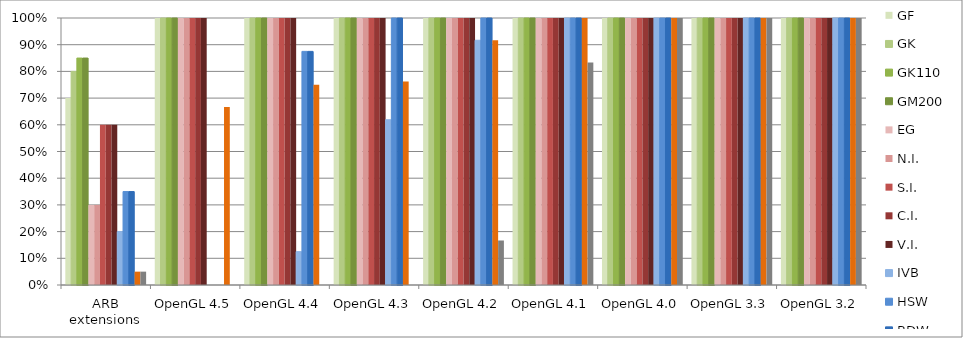
| Category | GF | GK | GK110 | GM200 | EG | N.I. | S.I. | C.I. | V.I. | IVB | HSW | BDW | Mesa | MacOS X |
|---|---|---|---|---|---|---|---|---|---|---|---|---|---|---|
| ARB extensions | 0.7 | 0.8 | 0.85 | 0.85 | 0.3 | 0.3 | 0.6 | 0.6 | 0.6 | 0.2 | 0.35 | 0.35 | 0.05 | 0.05 |
| OpenGL 4.5 | 1 | 1 | 1 | 1 | 1 | 1 | 1 | 1 | 1 | 0 | 0 | 0 | 0.667 | 0 |
| OpenGL 4.4 | 1 | 1 | 1 | 1 | 1 | 1 | 1 | 1 | 1 | 0.125 | 0.875 | 0.875 | 0.75 | 0 |
| OpenGL 4.3 | 1 | 1 | 1 | 1 | 1 | 1 | 1 | 1 | 1 | 0.619 | 1 | 1 | 0.762 | 0 |
| OpenGL 4.2 | 1 | 1 | 1 | 1 | 1 | 1 | 1 | 1 | 1 | 0.917 | 1 | 1 | 0.917 | 0.167 |
| OpenGL 4.1 | 1 | 1 | 1 | 1 | 1 | 1 | 1 | 1 | 1 | 1 | 1 | 1 | 1 | 0.833 |
| OpenGL 4.0 | 1 | 1 | 1 | 1 | 1 | 1 | 1 | 1 | 1 | 1 | 1 | 1 | 1 | 1 |
| OpenGL 3.3 | 1 | 1 | 1 | 1 | 1 | 1 | 1 | 1 | 1 | 1 | 1 | 1 | 1 | 1 |
| OpenGL 3.2 | 1 | 1 | 1 | 1 | 1 | 1 | 1 | 1 | 1 | 1 | 1 | 1 | 1 | 1 |